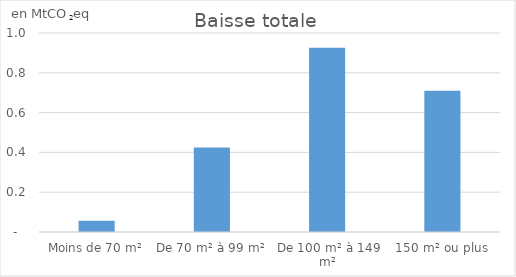
| Category | Baisse totale |
|---|---|
| Moins de 70 m² | 0.057 |
| De 70 m² à 99 m² | 0.424 |
| De 100 m² à 149 m² | 0.926 |
| 150 m² ou plus | 0.709 |